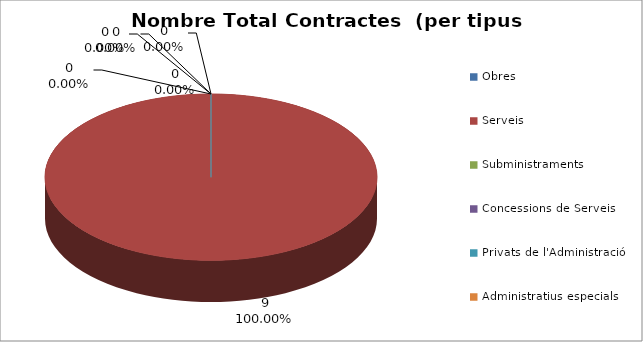
| Category | Nombre Total Contractes |
|---|---|
| Obres | 0 |
| Serveis | 9 |
| Subministraments | 0 |
| Concessions de Serveis | 0 |
| Privats de l'Administració | 0 |
| Administratius especials | 0 |